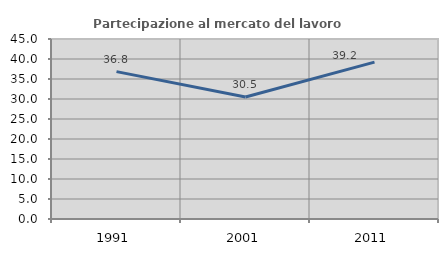
| Category | Partecipazione al mercato del lavoro  femminile |
|---|---|
| 1991.0 | 36.842 |
| 2001.0 | 30.508 |
| 2011.0 | 39.216 |